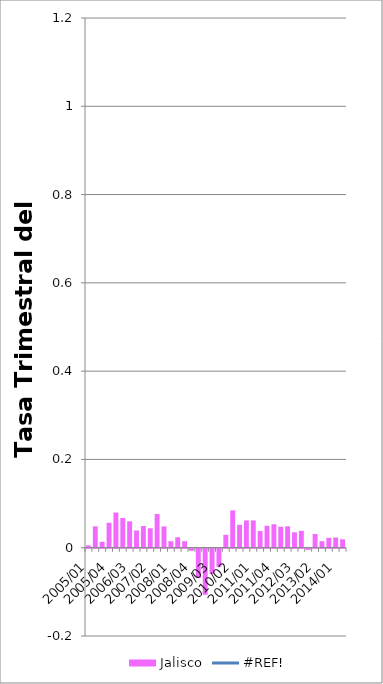
| Category | Jalisco |
|---|---|
| 2005/01 | 0.005 |
| 2005/02 | 0.048 |
| 2005/03 | 0.013 |
| 2005/04 | 0.057 |
| 2006/01 | 0.08 |
| 2006/02 | 0.067 |
| 2006/03 | 0.06 |
| 2006/04 | 0.039 |
| 2007/01 | 0.049 |
| 2007/02 | 0.044 |
| 2007/03 | 0.077 |
| 2007/04 | 0.048 |
| 2008/01 | 0.015 |
| 2008/02 | 0.024 |
| 2008/03 | 0.015 |
| 2008/04 | -0.005 |
| 2009/01 | -0.067 |
| 2009/02 | -0.104 |
| 2009/03 | -0.057 |
| 2009/04 | -0.041 |
| 2010/01 | 0.029 |
| 2010/02 | 0.085 |
| 2010/03 | 0.052 |
| 2010/04 | 0.062 |
| 2011/01 | 0.062 |
| 2011/02 | 0.038 |
| 2011/03 | 0.05 |
| 2011/04 | 0.053 |
| 2012/01 | 0.048 |
| 2012/02 | 0.049 |
| 2012/03 | 0.035 |
| 2012/04 | 0.038 |
| 2013/01 | -0.003 |
| 2013/02 | 0.031 |
| 2013/03 | 0.015 |
| 2013/04 | 0.022 |
| 2014/01 | 0.023 |
| 2014/02 | 0.019 |